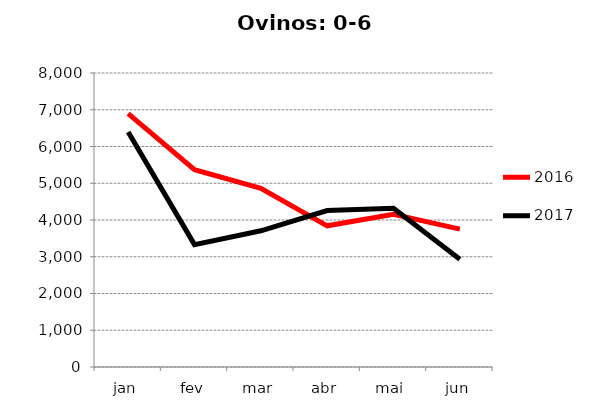
| Category | 2016 | 2017 |
|---|---|---|
| jan | 6897 | 6396 |
| fev | 5368 | 3331 |
| mar | 4864 | 3706 |
| abr | 3842 | 4256 |
| mai | 4155 | 4319 |
| jun | 3753 | 2930 |